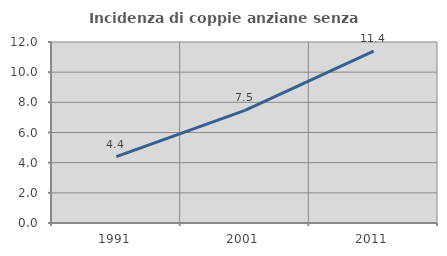
| Category | Incidenza di coppie anziane senza figli  |
|---|---|
| 1991.0 | 4.406 |
| 2001.0 | 7.465 |
| 2011.0 | 11.39 |